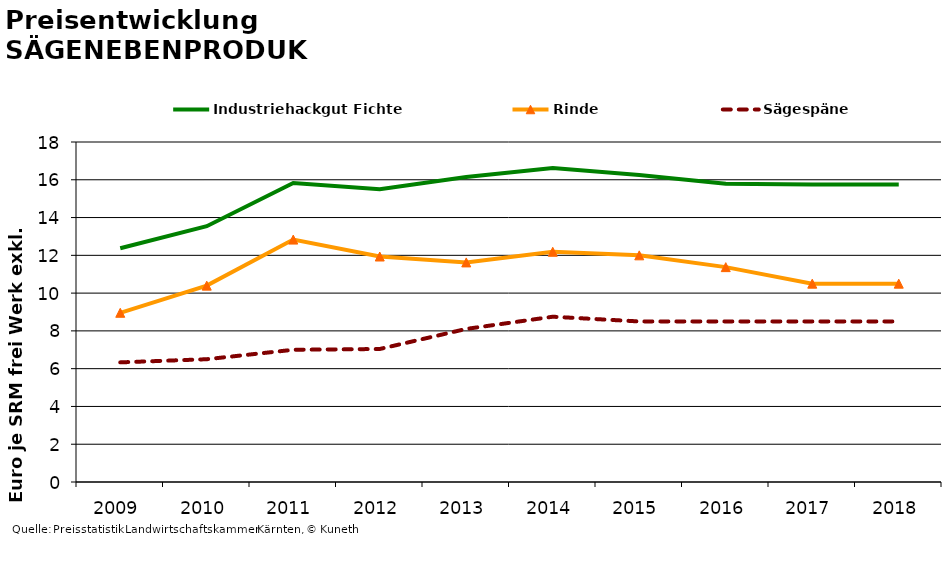
| Category | Industriehackgut Fichte | Rinde | Sägespäne |
|---|---|---|---|
| 2009.0 | 12.375 | 8.958 | 6.333 |
| 2010.0 | 13.542 | 10.396 | 6.5 |
| 2011.0 | 15.833 | 12.833 | 7 |
| 2012.0 | 15.5 | 11.938 | 7.042 |
| 2013.0 | 16.146 | 11.625 | 8.104 |
| 2014.0 | 16.625 | 12.188 | 8.75 |
| 2015.0 | 16.25 | 12 | 8.5 |
| 2016.0 | 15.792 | 11.375 | 8.5 |
| 2017.0 | 15.75 | 10.5 | 8.5 |
| 2018.0 | 15.75 | 10.5 | 8.5 |